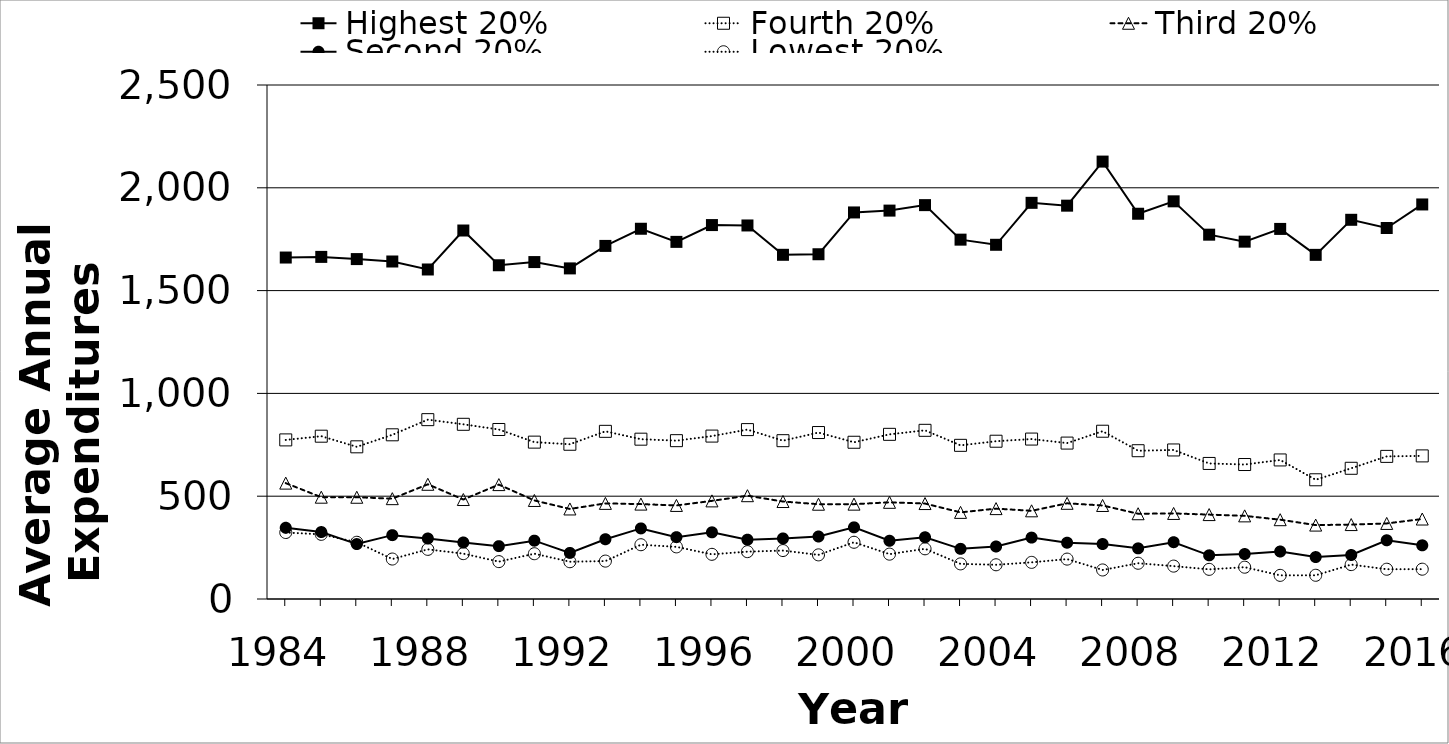
| Category | Highest 20% | Fourth 20% | Third 20% | Second 20% | Lowest 20% |
|---|---|---|---|---|---|
| 1984.0 | 1660.828 | 773.821 | 563.619 | 346.487 | 323.388 |
| 1985.0 | 1663.941 | 791.822 | 495.167 | 325.651 | 314.498 |
| 1986.0 | 1653.285 | 740.146 | 494.891 | 267.153 | 275.912 |
| 1987.0 | 1641.549 | 798.592 | 488.028 | 310.563 | 194.366 |
| 1988.0 | 1602.705 | 872.358 | 557.904 | 294.167 | 241.42 |
| 1989.0 | 1792.258 | 849.677 | 483.871 | 274.839 | 220.645 |
| 1990.0 | 1623.259 | 824.484 | 556.389 | 257.077 | 181.79 |
| 1991.0 | 1638.767 | 762.996 | 479.295 | 283.7 | 220.264 |
| 1992.0 | 1607.983 | 752.673 | 437.919 | 224.091 | 181.326 |
| 1993.0 | 1717.37 | 815.502 | 465.052 | 290.657 | 184.36 |
| 1994.0 | 1800.81 | 777.328 | 461.538 | 343.32 | 263.968 |
| 1995.0 | 1737.008 | 770.079 | 455.118 | 300.787 | 253.543 |
| 1996.0 | 1818.738 | 792.352 | 477.247 | 324.283 | 217.208 |
| 1997.0 | 1816.822 | 823.925 | 502.43 | 288.598 | 230.28 |
| 1998.0 | 1674.11 | 770.061 | 474.11 | 294.479 | 235.583 |
| 1999.0 | 1676.831 | 809.604 | 460.984 | 303.962 | 214.646 |
| 2000.0 | 1880.139 | 762.369 | 461.324 | 348.432 | 275.958 |
| 2001.0 | 1889.102 | 800.903 | 470.243 | 283.23 | 218.182 |
| 2002.0 | 1915.731 | 820.456 | 464.258 | 300.167 | 244.136 |
| 2003.0 | 1747.826 | 747.391 | 421.304 | 243.913 | 170.87 |
| 2004.0 | 1722.816 | 767.39 | 439.598 | 255.373 | 166.437 |
| 2005.0 | 1926.882 | 777.88 | 428.879 | 298.618 | 178.187 |
| 2006.0 | 1913.095 | 758.333 | 465.476 | 273.81 | 194.048 |
| 2007.0 | 2127.499 | 816.043 | 454.901 | 267.384 | 141.216 |
| 2008.0 | 1873.824 | 721.216 | 414.671 | 246.35 | 173.894 |
| 2009.0 | 1934.212 | 724.91 | 416.152 | 276.316 | 159.972 |
| 2010.0 | 1772.022 | 659.28 | 410.537 | 212.422 | 144.183 |
| 2011.0 | 1738.071 | 654.044 | 404.376 | 218.726 | 154.709 |
| 2012.0 | 1800 | 676.307 | 385.714 | 231.01 | 114.983 |
| 2013.0 | 1673.82 | 579.914 | 359.485 | 203.948 | 115.365 |
| 2014.0 | 1844.36 | 635.741 | 361.977 | 213.942 | 167.3 |
| 2015.0 | 1804.557 | 693.671 | 367.595 | 285.57 | 144.81 |
| 2016.0 | 1919 | 696 | 389 | 261 | 145 |